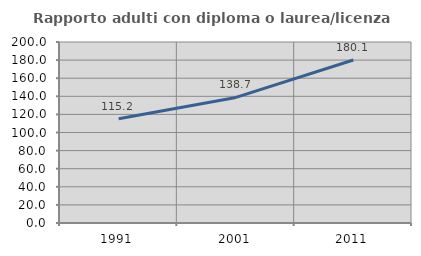
| Category | Rapporto adulti con diploma o laurea/licenza media  |
|---|---|
| 1991.0 | 115.17 |
| 2001.0 | 138.737 |
| 2011.0 | 180.053 |